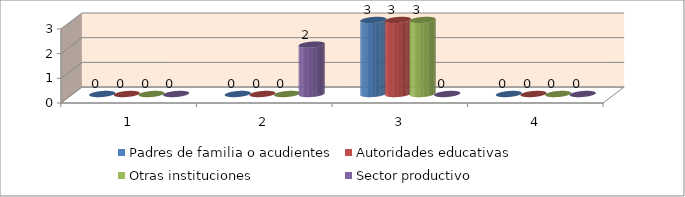
| Category | Padres de familia o acudientes | Autoridades educativas | Otras instituciones | Sector productivo |
|---|---|---|---|---|
| 0 | 0 | 0 | 0 | 0 |
| 1 | 0 | 0 | 0 | 2 |
| 2 | 3 | 3 | 3 | 0 |
| 3 | 0 | 0 | 0 | 0 |